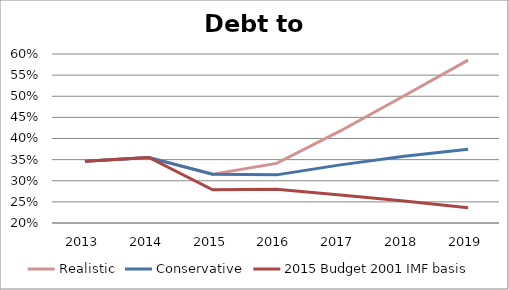
| Category | Realistic | Conservative | 2015 Budget 2001 IMF basis |
|---|---|---|---|
| 2013.0 | 0.346 | 0.346 | 0.346 |
| 2014.0 | 0.355 | 0.355 | 0.355 |
| 2015.0 | 0.316 | 0.316 | 0.278 |
| 2016.0 | 0.341 | 0.314 | 0.28 |
| 2017.0 | 0.418 | 0.338 | 0.266 |
| 2018.0 | 0.501 | 0.358 | 0.252 |
| 2019.0 | 0.585 | 0.375 | 0.236 |